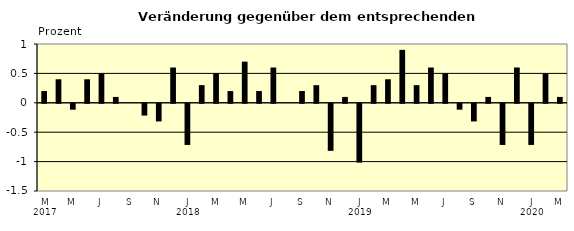
| Category | Series 0 |
|---|---|
| 0 | 0.2 |
| 1 | 0.4 |
| 2 | -0.1 |
| 3 | 0.4 |
| 4 | 0.5 |
| 5 | 0.1 |
| 6 | 0 |
| 7 | -0.2 |
| 8 | -0.3 |
| 9 | 0.6 |
| 10 | -0.7 |
| 11 | 0.3 |
| 12 | 0.5 |
| 13 | 0.2 |
| 14 | 0.7 |
| 15 | 0.2 |
| 16 | 0.6 |
| 17 | 0 |
| 18 | 0.2 |
| 19 | 0.3 |
| 20 | -0.8 |
| 21 | 0.1 |
| 22 | -1 |
| 23 | 0.3 |
| 24 | 0.4 |
| 25 | 0.9 |
| 26 | 0.3 |
| 27 | 0.6 |
| 28 | 0.5 |
| 29 | -0.1 |
| 30 | -0.3 |
| 31 | 0.1 |
| 32 | -0.7 |
| 33 | 0.6 |
| 34 | -0.7 |
| 35 | 0.5 |
| 36 | 0.1 |